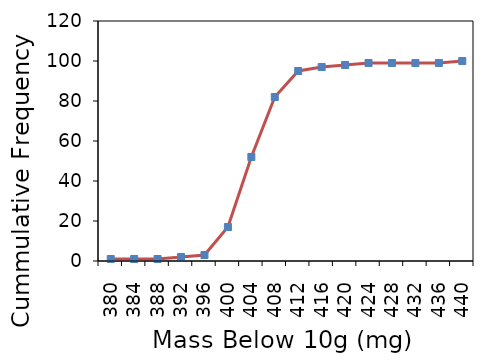
| Category | Series 1 |
|---|---|
| 380.0 | 1 |
| 384.0 | 1 |
| 388.0 | 1 |
| 392.0 | 2 |
| 396.0 | 3 |
| 400.0 | 17 |
| 404.0 | 52 |
| 408.0 | 82 |
| 412.0 | 95 |
| 416.0 | 97 |
| 420.0 | 98 |
| 424.0 | 99 |
| 428.0 | 99 |
| 432.0 | 99 |
| 436.0 | 99 |
| 440.0 | 100 |